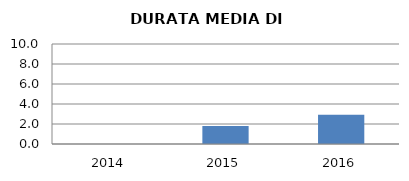
| Category | 2014 2015 2016 |
|---|---|
| 2014.0 | 0 |
| 2015.0 | 1.8 |
| 2016.0 | 2.917 |